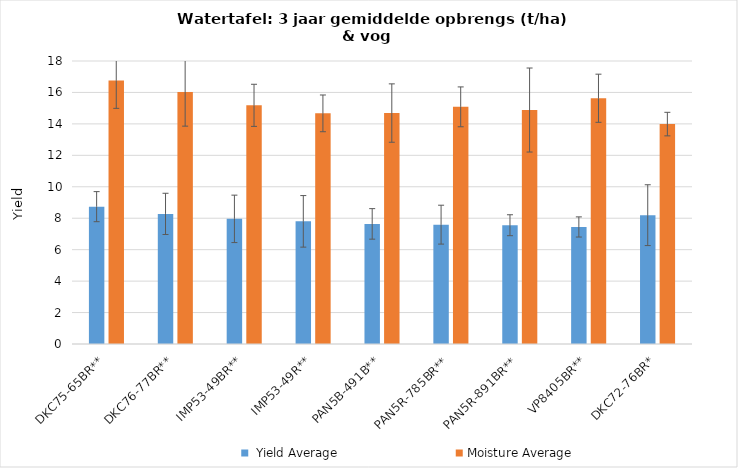
| Category |  Yield Average | Moisture Average |
|---|---|---|
| DKC75-65BR** | 8.736 | 16.762 |
| DKC76-77BR** | 8.276 | 16.031 |
| IMP53-49BR** | 7.96 | 15.18 |
| IMP53-49R** | 7.8 | 14.67 |
| PAN5B-491B** | 7.639 | 14.689 |
| PAN5R-785BR** | 7.591 | 15.084 |
| PAN5R-891BR** | 7.555 | 14.881 |
| VP8405BR** | 7.444 | 15.631 |
| DKC72-76BR* | 8.194 | 13.987 |